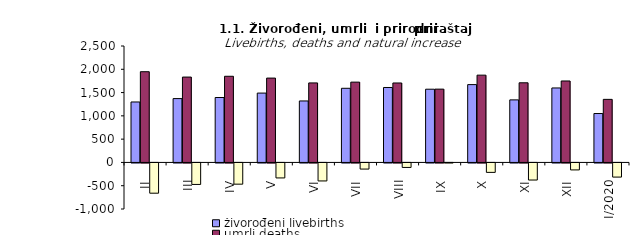
| Category | živorođeni livebirths | umrli deaths | prirodni priraštaj natural increase |
|---|---|---|---|
| II | 1298 | 1948 | -650 |
| III | 1371 | 1833 | -462 |
| IV | 1394 | 1850 | -456 |
| V | 1489 | 1811 | -322 |
| VI | 1320 | 1707 | -387 |
| VII | 1592 | 1724 | -132 |
| VIII | 1609 | 1706 | -97 |
| IX | 1572 | 1574 | -2 |
| X | 1671 | 1874 | -203 |
| XI | 1343 | 1710 | -367 |
| XII | 1599 | 1749 | -150 |
| I/2020 | 1050 | 1354 | -304 |